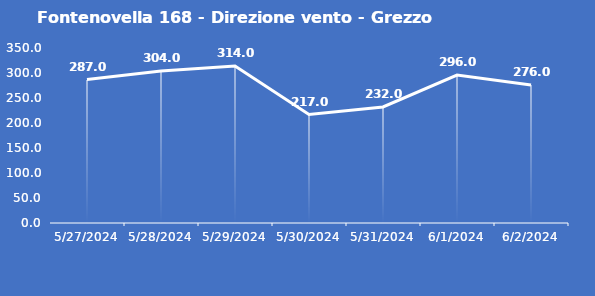
| Category | Fontenovella 168 - Direzione vento - Grezzo (°N) |
|---|---|
| 5/27/24 | 287 |
| 5/28/24 | 304 |
| 5/29/24 | 314 |
| 5/30/24 | 217 |
| 5/31/24 | 232 |
| 6/1/24 | 296 |
| 6/2/24 | 276 |